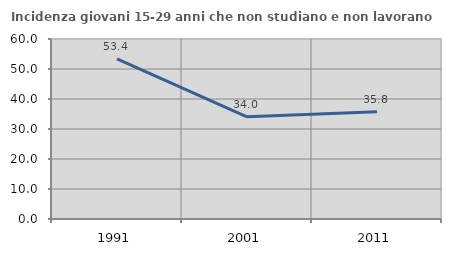
| Category | Incidenza giovani 15-29 anni che non studiano e non lavorano  |
|---|---|
| 1991.0 | 53.363 |
| 2001.0 | 34.043 |
| 2011.0 | 35.789 |